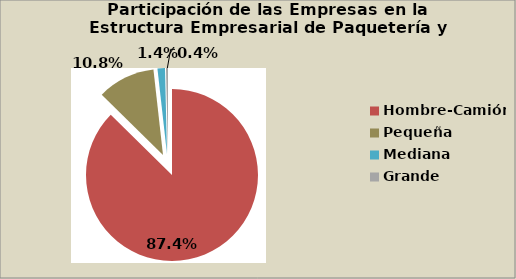
| Category | Series 0 |
|---|---|
| Hombre-Camión | 87.383 |
| Pequeña | 10.841 |
| Mediana | 1.402 |
| Grande | 0.374 |